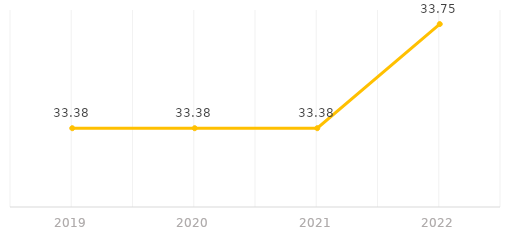
| Category | Longitud de la red de ciclovía |
|---|---|
| 2019.0 | 33.38 |
| 2020.0 | 33.38 |
| 2021.0 | 33.38 |
| 2022.0 | 33.75 |